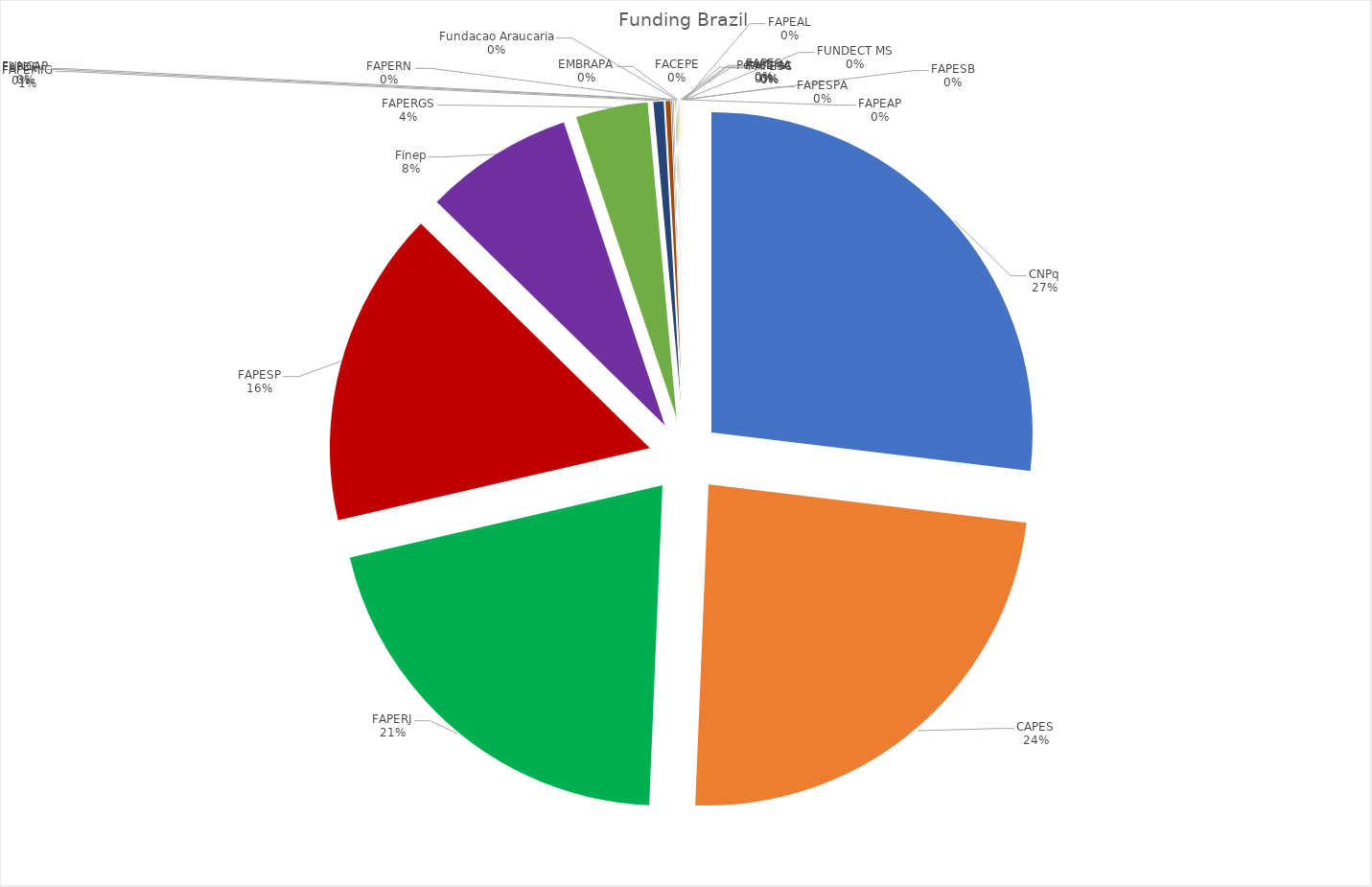
| Category | Web of Science Documents |
|---|---|
| CNPq | 1921 |
| CAPES | 1695 |
| FAPERJ | 1479 |
| FAPESP | 1139 |
| Finep | 538 |
| FAPERGS | 262 |
| FAPEMIG | 40 |
| FAPDF | 21 |
| FUNCAP | 6 |
| FAPERN | 5 |
| Fundacao Araucaria | 4 |
| EMBRAPA | 4 |
| FACEPE | 4 |
| FAPES | 4 |
| FAPESC | 3 |
| FAPESB | 3 |
| Petrobras | 2 |
| FAPEMA | 2 |
| FUNDECT MS | 2 |
| FAPEAL | 2 |
| FAPESPA | 1 |
| FAPEAP | 1 |